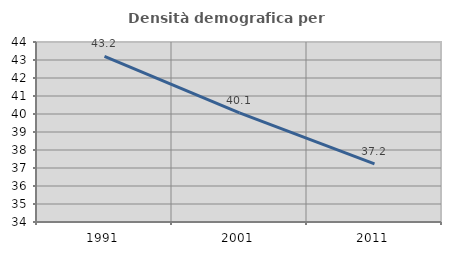
| Category | Densità demografica |
|---|---|
| 1991.0 | 43.197 |
| 2001.0 | 40.059 |
| 2011.0 | 37.227 |